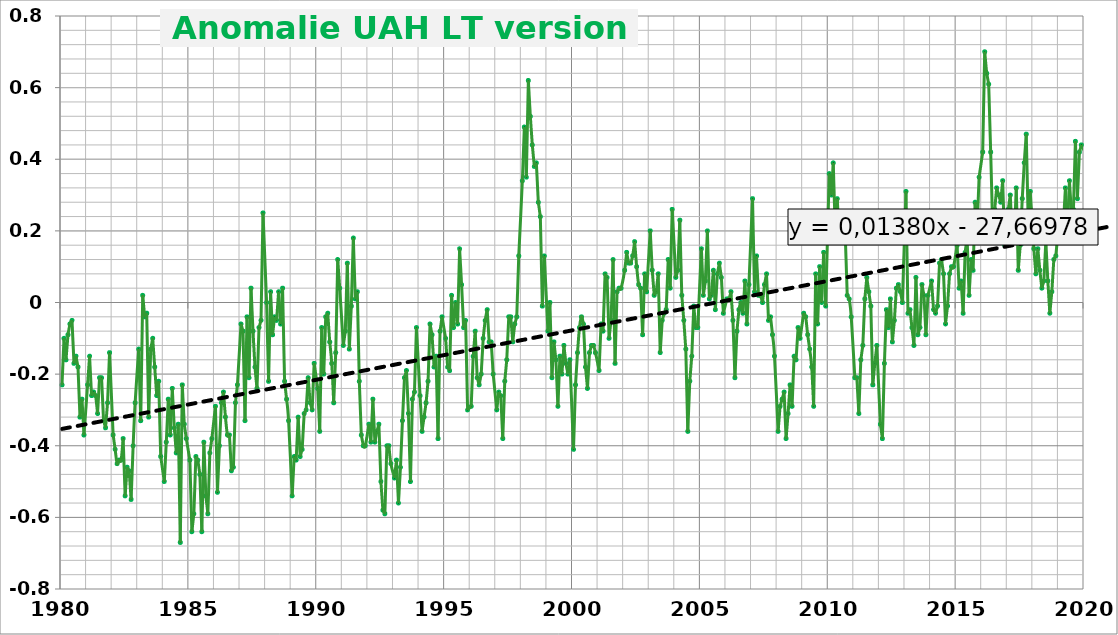
| Category | Series 0 |
|---|---|
| 1980.078125 | -0.23 |
| 1980.15625 | -0.1 |
| 1980.234375 | -0.16 |
| 1980.3125 | -0.09 |
| 1980.390625 | -0.06 |
| 1980.46875 | -0.05 |
| 1980.546875 | -0.17 |
| 1980.625 | -0.15 |
| 1980.703125 | -0.18 |
| 1980.78125 | -0.32 |
| 1980.859375 | -0.27 |
| 1980.9375 | -0.37 |
| 1981.078125 | -0.23 |
| 1981.15625 | -0.15 |
| 1981.234375 | -0.26 |
| 1981.3125 | -0.25 |
| 1981.390625 | -0.26 |
| 1981.46875 | -0.31 |
| 1981.546875 | -0.21 |
| 1981.625 | -0.21 |
| 1981.703125 | -0.33 |
| 1981.78125 | -0.35 |
| 1981.859375 | -0.28 |
| 1981.9375 | -0.14 |
| 1982.078125 | -0.37 |
| 1982.15625 | -0.41 |
| 1982.234375 | -0.45 |
| 1982.3125 | -0.44 |
| 1982.390625 | -0.44 |
| 1982.46875 | -0.38 |
| 1982.546875 | -0.54 |
| 1982.625 | -0.46 |
| 1982.703125 | -0.47 |
| 1982.78125 | -0.55 |
| 1982.859375 | -0.4 |
| 1982.9375 | -0.28 |
| 1983.078125 | -0.13 |
| 1983.15625 | -0.33 |
| 1983.234375 | 0.02 |
| 1983.3125 | -0.04 |
| 1983.390625 | -0.03 |
| 1983.46875 | -0.32 |
| 1983.546875 | -0.13 |
| 1983.625 | -0.1 |
| 1983.703125 | -0.18 |
| 1983.78125 | -0.26 |
| 1983.859375 | -0.22 |
| 1983.9375 | -0.43 |
| 1984.078125 | -0.5 |
| 1984.15625 | -0.39 |
| 1984.234375 | -0.27 |
| 1984.3125 | -0.37 |
| 1984.390625 | -0.24 |
| 1984.46875 | -0.35 |
| 1984.546875 | -0.42 |
| 1984.625 | -0.34 |
| 1984.703125 | -0.67 |
| 1984.78125 | -0.23 |
| 1984.859375 | -0.34 |
| 1984.9375 | -0.38 |
| 1985.078125 | -0.44 |
| 1985.15625 | -0.64 |
| 1985.234375 | -0.59 |
| 1985.3125 | -0.43 |
| 1985.390625 | -0.44 |
| 1985.46875 | -0.48 |
| 1985.546875 | -0.64 |
| 1985.625 | -0.39 |
| 1985.703125 | -0.54 |
| 1985.78125 | -0.59 |
| 1985.859375 | -0.42 |
| 1985.9375 | -0.38 |
| 1986.078125 | -0.29 |
| 1986.15625 | -0.53 |
| 1986.234375 | -0.4 |
| 1986.3125 | -0.28 |
| 1986.390625 | -0.25 |
| 1986.46875 | -0.32 |
| 1986.546875 | -0.37 |
| 1986.625 | -0.37 |
| 1986.703125 | -0.47 |
| 1986.78125 | -0.46 |
| 1986.859375 | -0.28 |
| 1986.9375 | -0.23 |
| 1987.078125 | -0.06 |
| 1987.15625 | -0.08 |
| 1987.234375 | -0.33 |
| 1987.3125 | -0.04 |
| 1987.390625 | -0.21 |
| 1987.46875 | 0.04 |
| 1987.546875 | -0.08 |
| 1987.625 | -0.18 |
| 1987.703125 | -0.24 |
| 1987.78125 | -0.07 |
| 1987.859375 | -0.05 |
| 1987.9375 | 0.25 |
| 1988.078125 | 0 |
| 1988.15625 | -0.22 |
| 1988.234375 | 0.03 |
| 1988.3125 | -0.09 |
| 1988.390625 | -0.04 |
| 1988.46875 | -0.05 |
| 1988.546875 | 0.03 |
| 1988.625 | -0.06 |
| 1988.703125 | 0.04 |
| 1988.78125 | -0.22 |
| 1988.859375 | -0.27 |
| 1988.9375 | -0.33 |
| 1989.078125 | -0.54 |
| 1989.15625 | -0.43 |
| 1989.234375 | -0.44 |
| 1989.3125 | -0.32 |
| 1989.390625 | -0.43 |
| 1989.46875 | -0.41 |
| 1989.546875 | -0.31 |
| 1989.625 | -0.3 |
| 1989.703125 | -0.21 |
| 1989.78125 | -0.28 |
| 1989.859375 | -0.3 |
| 1989.9375 | -0.17 |
| 1990.078125 | -0.24 |
| 1990.15625 | -0.36 |
| 1990.234375 | -0.07 |
| 1990.3125 | -0.2 |
| 1990.390625 | -0.04 |
| 1990.46875 | -0.03 |
| 1990.546875 | -0.11 |
| 1990.625 | -0.17 |
| 1990.703125 | -0.28 |
| 1990.78125 | -0.14 |
| 1990.859375 | 0.12 |
| 1990.9375 | 0.04 |
| 1991.078125 | -0.12 |
| 1991.15625 | -0.08 |
| 1991.234375 | 0.11 |
| 1991.3125 | -0.13 |
| 1991.390625 | -0.01 |
| 1991.46875 | 0.18 |
| 1991.546875 | 0.01 |
| 1991.625 | 0.03 |
| 1991.703125 | -0.22 |
| 1991.78125 | -0.37 |
| 1991.859375 | -0.4 |
| 1991.9375 | -0.4 |
| 1992.078125 | -0.34 |
| 1992.15625 | -0.39 |
| 1992.234375 | -0.27 |
| 1992.3125 | -0.39 |
| 1992.390625 | -0.36 |
| 1992.46875 | -0.34 |
| 1992.546875 | -0.5 |
| 1992.625 | -0.58 |
| 1992.703125 | -0.59 |
| 1992.78125 | -0.4 |
| 1992.859375 | -0.4 |
| 1992.9375 | -0.45 |
| 1993.078125 | -0.49 |
| 1993.15625 | -0.44 |
| 1993.234375 | -0.56 |
| 1993.3125 | -0.46 |
| 1993.390625 | -0.33 |
| 1993.46875 | -0.21 |
| 1993.546875 | -0.19 |
| 1993.625 | -0.31 |
| 1993.703125 | -0.5 |
| 1993.78125 | -0.27 |
| 1993.859375 | -0.25 |
| 1993.9375 | -0.07 |
| 1994.078125 | -0.26 |
| 1994.15625 | -0.36 |
| 1994.234375 | -0.32 |
| 1994.3125 | -0.28 |
| 1994.390625 | -0.22 |
| 1994.46875 | -0.06 |
| 1994.546875 | -0.09 |
| 1994.625 | -0.18 |
| 1994.703125 | -0.15 |
| 1994.78125 | -0.38 |
| 1994.859375 | -0.08 |
| 1994.9375 | -0.04 |
| 1995.078125 | -0.1 |
| 1995.15625 | -0.18 |
| 1995.234375 | -0.19 |
| 1995.3125 | 0.02 |
| 1995.390625 | -0.07 |
| 1995.46875 | 0 |
| 1995.546875 | -0.06 |
| 1995.625 | 0.15 |
| 1995.703125 | 0.05 |
| 1995.78125 | -0.07 |
| 1995.859375 | -0.05 |
| 1995.9375 | -0.3 |
| 1996.078125 | -0.29 |
| 1996.15625 | -0.15 |
| 1996.234375 | -0.08 |
| 1996.3125 | -0.21 |
| 1996.390625 | -0.23 |
| 1996.46875 | -0.2 |
| 1996.546875 | -0.1 |
| 1996.625 | -0.05 |
| 1996.703125 | -0.02 |
| 1996.78125 | -0.11 |
| 1996.859375 | -0.11 |
| 1996.9375 | -0.2 |
| 1997.078125 | -0.3 |
| 1997.15625 | -0.25 |
| 1997.234375 | -0.26 |
| 1997.3125 | -0.38 |
| 1997.390625 | -0.22 |
| 1997.46875 | -0.16 |
| 1997.546875 | -0.04 |
| 1997.625 | -0.04 |
| 1997.703125 | -0.11 |
| 1997.78125 | -0.06 |
| 1997.859375 | -0.04 |
| 1997.9375 | 0.13 |
| 1998.078125 | 0.34 |
| 1998.15625 | 0.49 |
| 1998.234375 | 0.35 |
| 1998.3125 | 0.62 |
| 1998.390625 | 0.52 |
| 1998.46875 | 0.44 |
| 1998.546875 | 0.38 |
| 1998.625 | 0.39 |
| 1998.703125 | 0.28 |
| 1998.78125 | 0.24 |
| 1998.859375 | -0.01 |
| 1998.9375 | 0.13 |
| 1999.078125 | -0.08 |
| 1999.15625 | 0 |
| 1999.234375 | -0.21 |
| 1999.3125 | -0.11 |
| 1999.390625 | -0.16 |
| 1999.46875 | -0.29 |
| 1999.546875 | -0.15 |
| 1999.625 | -0.2 |
| 1999.703125 | -0.12 |
| 1999.78125 | -0.17 |
| 1999.859375 | -0.2 |
| 1999.9375 | -0.16 |
| 2000.078125 | -0.41 |
| 2000.15625 | -0.23 |
| 2000.234375 | -0.14 |
| 2000.3125 | -0.07 |
| 2000.390625 | -0.04 |
| 2000.46875 | -0.06 |
| 2000.546875 | -0.18 |
| 2000.625 | -0.24 |
| 2000.703125 | -0.14 |
| 2000.78125 | -0.12 |
| 2000.859375 | -0.12 |
| 2000.9375 | -0.14 |
| 2001.078125 | -0.19 |
| 2001.15625 | -0.06 |
| 2001.234375 | -0.08 |
| 2001.3125 | 0.08 |
| 2001.390625 | 0.07 |
| 2001.46875 | -0.1 |
| 2001.546875 | -0.05 |
| 2001.625 | 0.12 |
| 2001.703125 | -0.17 |
| 2001.78125 | 0.03 |
| 2001.859375 | 0.04 |
| 2001.9375 | 0.04 |
| 2002.078125 | 0.09 |
| 2002.15625 | 0.14 |
| 2002.234375 | 0.11 |
| 2002.3125 | 0.11 |
| 2002.390625 | 0.13 |
| 2002.46875 | 0.17 |
| 2002.546875 | 0.1 |
| 2002.625 | 0.05 |
| 2002.703125 | 0.04 |
| 2002.78125 | -0.09 |
| 2002.859375 | 0.08 |
| 2002.9375 | 0.03 |
| 2003.078125 | 0.2 |
| 2003.15625 | 0.09 |
| 2003.234375 | 0.02 |
| 2003.3125 | 0.03 |
| 2003.390625 | 0.08 |
| 2003.46875 | -0.14 |
| 2003.546875 | -0.05 |
| 2003.625 | -0.03 |
| 2003.703125 | -0.02 |
| 2003.78125 | 0.12 |
| 2003.859375 | 0.04 |
| 2003.9375 | 0.26 |
| 2004.078125 | 0.07 |
| 2004.15625 | 0.09 |
| 2004.234375 | 0.23 |
| 2004.3125 | 0.02 |
| 2004.390625 | -0.05 |
| 2004.46875 | -0.13 |
| 2004.546875 | -0.36 |
| 2004.625 | -0.22 |
| 2004.703125 | -0.15 |
| 2004.78125 | -0.01 |
| 2004.859375 | -0.07 |
| 2004.9375 | -0.07 |
| 2005.078125 | 0.15 |
| 2005.15625 | 0.02 |
| 2005.234375 | 0.06 |
| 2005.3125 | 0.2 |
| 2005.390625 | 0.01 |
| 2005.46875 | 0.02 |
| 2005.546875 | 0.09 |
| 2005.625 | -0.02 |
| 2005.703125 | 0.08 |
| 2005.78125 | 0.11 |
| 2005.859375 | 0.07 |
| 2005.9375 | -0.03 |
| 2006.078125 | 0.01 |
| 2006.15625 | 0.01 |
| 2006.234375 | 0.03 |
| 2006.3125 | -0.05 |
| 2006.390625 | -0.21 |
| 2006.46875 | -0.08 |
| 2006.546875 | -0.02 |
| 2006.625 | 0 |
| 2006.703125 | -0.03 |
| 2006.78125 | 0.06 |
| 2006.859375 | -0.06 |
| 2006.9375 | 0.05 |
| 2007.078125 | 0.29 |
| 2007.15625 | 0.03 |
| 2007.234375 | 0.13 |
| 2007.3125 | 0.02 |
| 2007.390625 | 0.02 |
| 2007.46875 | 0 |
| 2007.546875 | 0.05 |
| 2007.625 | 0.08 |
| 2007.703125 | -0.05 |
| 2007.78125 | -0.04 |
| 2007.859375 | -0.09 |
| 2007.9375 | -0.15 |
| 2008.078125 | -0.36 |
| 2008.15625 | -0.29 |
| 2008.234375 | -0.27 |
| 2008.3125 | -0.25 |
| 2008.390625 | -0.38 |
| 2008.46875 | -0.31 |
| 2008.546875 | -0.23 |
| 2008.625 | -0.29 |
| 2008.703125 | -0.15 |
| 2008.78125 | -0.16 |
| 2008.859375 | -0.07 |
| 2008.9375 | -0.1 |
| 2009.078125 | -0.03 |
| 2009.15625 | -0.04 |
| 2009.234375 | -0.09 |
| 2009.3125 | -0.13 |
| 2009.390625 | -0.18 |
| 2009.46875 | -0.29 |
| 2009.546875 | 0.08 |
| 2009.625 | -0.06 |
| 2009.703125 | 0.1 |
| 2009.78125 | 0 |
| 2009.859375 | 0.14 |
| 2009.9375 | -0.01 |
| 2010.078125 | 0.36 |
| 2010.15625 | 0.3 |
| 2010.234375 | 0.39 |
| 2010.3125 | 0.2 |
| 2010.390625 | 0.29 |
| 2010.46875 | 0.18 |
| 2010.546875 | 0.2 |
| 2010.625 | 0.21 |
| 2010.703125 | 0.19 |
| 2010.78125 | 0.02 |
| 2010.859375 | 0.01 |
| 2010.9375 | -0.04 |
| 2011.078125 | -0.21 |
| 2011.15625 | -0.21 |
| 2011.234375 | -0.31 |
| 2011.3125 | -0.16 |
| 2011.390625 | -0.12 |
| 2011.46875 | 0.01 |
| 2011.546875 | 0.07 |
| 2011.625 | 0.03 |
| 2011.703125 | -0.01 |
| 2011.78125 | -0.23 |
| 2011.859375 | -0.17 |
| 2011.9375 | -0.12 |
| 2012.078125 | -0.34 |
| 2012.15625 | -0.38 |
| 2012.234375 | -0.17 |
| 2012.3125 | -0.02 |
| 2012.390625 | -0.07 |
| 2012.46875 | 0.01 |
| 2012.546875 | -0.11 |
| 2012.625 | -0.05 |
| 2012.703125 | 0.04 |
| 2012.78125 | 0.05 |
| 2012.859375 | 0.03 |
| 2012.9375 | 0 |
| 2013.078125 | 0.31 |
| 2013.15625 | -0.03 |
| 2013.234375 | -0.02 |
| 2013.3125 | -0.07 |
| 2013.390625 | -0.12 |
| 2013.46875 | 0.07 |
| 2013.546875 | -0.09 |
| 2013.625 | -0.07 |
| 2013.703125 | 0.05 |
| 2013.78125 | 0.02 |
| 2013.859375 | -0.09 |
| 2013.9375 | 0.02 |
| 2014.078125 | 0.06 |
| 2014.15625 | -0.02 |
| 2014.234375 | -0.03 |
| 2014.3125 | -0.01 |
| 2014.390625 | 0.11 |
| 2014.46875 | 0.12 |
| 2014.546875 | 0.08 |
| 2014.625 | -0.06 |
| 2014.703125 | -0.01 |
| 2014.78125 | 0.08 |
| 2014.859375 | 0.1 |
| 2014.9375 | 0.1 |
| 2015.078125 | 0.16 |
| 2015.15625 | 0.04 |
| 2015.234375 | 0.06 |
| 2015.3125 | -0.03 |
| 2015.390625 | 0.14 |
| 2015.46875 | 0.18 |
| 2015.546875 | 0.02 |
| 2015.625 | 0.12 |
| 2015.703125 | 0.09 |
| 2015.78125 | 0.28 |
| 2015.859375 | 0.21 |
| 2015.9375 | 0.35 |
| 2016.078125 | 0.42 |
| 2016.15625 | 0.7 |
| 2016.234375 | 0.64 |
| 2016.3125 | 0.61 |
| 2016.390625 | 0.42 |
| 2016.46875 | 0.21 |
| 2016.546875 | 0.26 |
| 2016.625 | 0.32 |
| 2016.703125 | 0.3 |
| 2016.78125 | 0.28 |
| 2016.859375 | 0.34 |
| 2016.9375 | 0.16 |
| 2017.078125 | 0.26 |
| 2017.15625 | 0.3 |
| 2017.234375 | 0.18 |
| 2017.3125 | 0.18 |
| 2017.390625 | 0.32 |
| 2017.46875 | 0.09 |
| 2017.546875 | 0.16 |
| 2017.625 | 0.29 |
| 2017.703125 | 0.39 |
| 2017.78125 | 0.47 |
| 2017.859375 | 0.22 |
| 2017.9375 | 0.31 |
| 2018.078125 | 0.15 |
| 2018.15625 | 0.08 |
| 2018.234375 | 0.15 |
| 2018.3125 | 0.09 |
| 2018.390625 | 0.04 |
| 2018.46875 | 0.06 |
| 2018.546875 | 0.17 |
| 2018.625 | 0.06 |
| 2018.703125 | -0.03 |
| 2018.78125 | 0.03 |
| 2018.859375 | 0.12 |
| 2018.9375 | 0.13 |
| 2019.078125 | 0.24 |
| 2019.15625 | 0.21 |
| 2019.234375 | 0.22 |
| 2019.3125 | 0.32 |
| 2019.390625 | 0.2 |
| 2019.46875 | 0.34 |
| 2019.546875 | 0.25 |
| 2019.625 | 0.26 |
| 2019.703125 | 0.45 |
| 2019.78125 | 0.29 |
| 2019.859375 | 0.42 |
| 2019.9375 | 0.44 |
| 2020.078125 | 0.42 |
| 2020.15625 | 0.59 |
| 2020.234375 | 0.35 |
| 2020.3125 | 0.26 |
| 2020.390625 | 0.42 |
| 2020.46875 | 0.3 |
| 2020.546875 | 0.31 |
| 2020.625 | 0.3 |
| 2020.703125 | 0.4 |
| 2020.78125 | 0.38 |
| 2020.859375 | 0.4 |
| 2020.9375 | 0.15 |